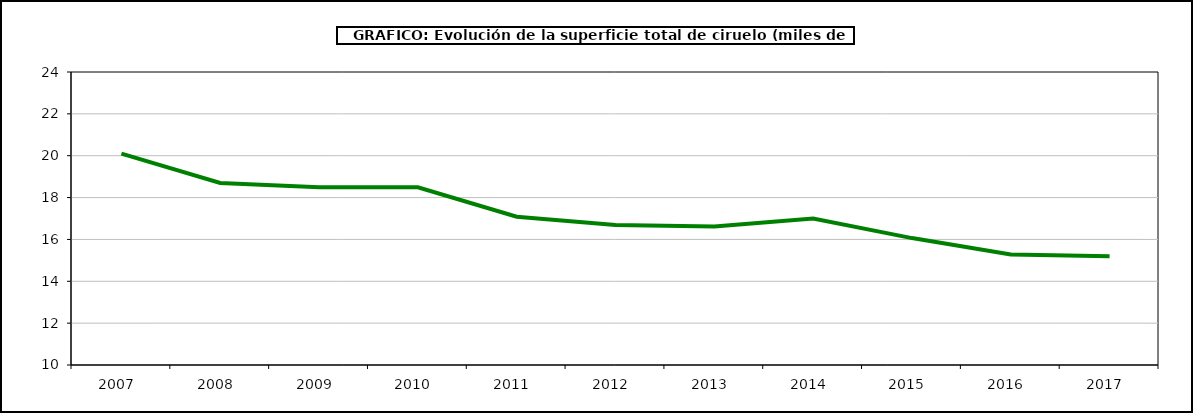
| Category | superficie ciruelo |
|---|---|
| 2007.0 | 20.101 |
| 2008.0 | 18.695 |
| 2009.0 | 18.489 |
| 2010.0 | 18.489 |
| 2011.0 | 17.086 |
| 2012.0 | 16.687 |
| 2013.0 | 16.614 |
| 2014.0 | 17.003 |
| 2015.0 | 16.064 |
| 2016.0 | 15.278 |
| 2017.0 | 15.199 |